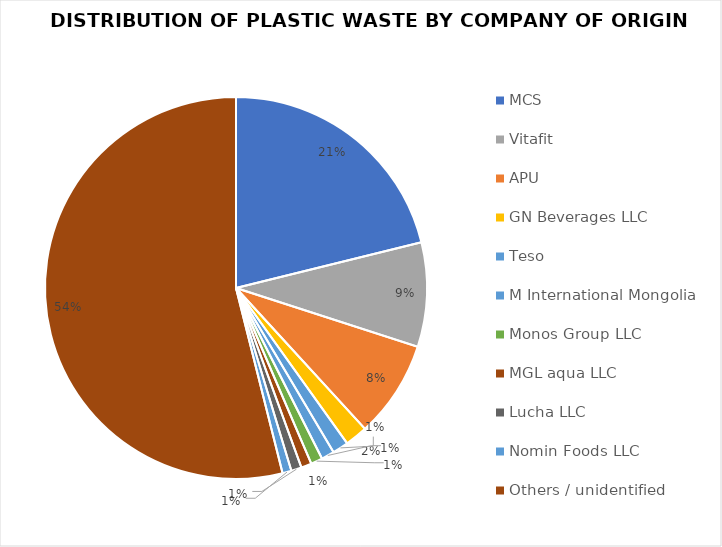
| Category | Series 0 |
|---|---|
| MCS | 2868 |
| Vitafit | 1198 |
| APU | 1114 |
| GN Beverages LLC | 260 |
| Teso | 184 |
| M International Mongolia | 149 |
| Monos Group LLC | 134 |
| MGL aqua LLC | 120 |
| Lucha LLC | 119 |
| Nomin Foods LLC | 103 |
| Others / unidentified | 7313 |